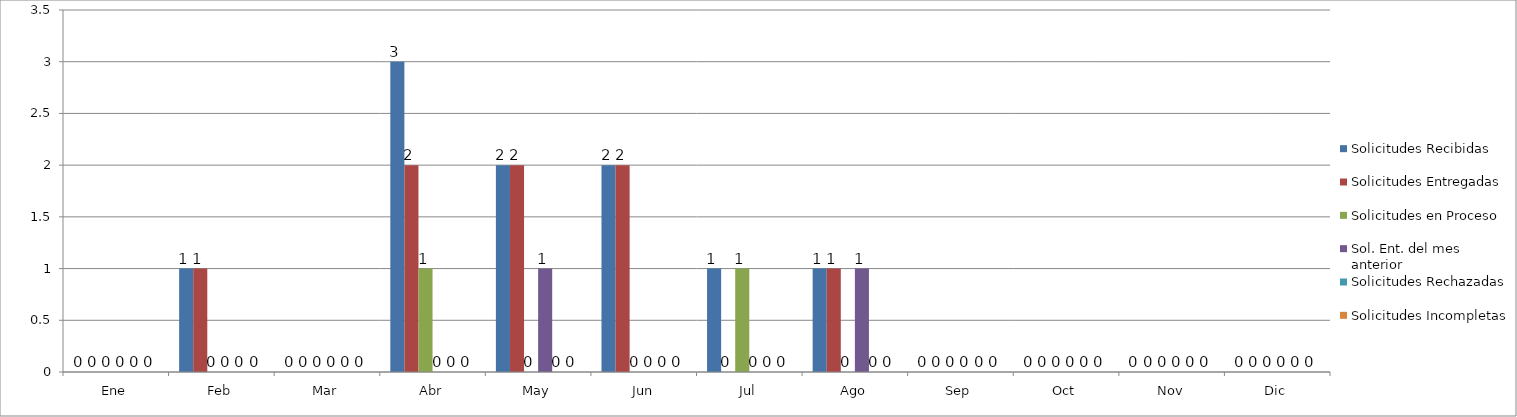
| Category | Solicitudes Recibidas  | Solicitudes Entregadas | Solicitudes en Proceso | Sol. Ent. del mes anterior | Solicitudes Rechazadas | Solicitudes Incompletas |
|---|---|---|---|---|---|---|
| Ene | 0 | 0 | 0 | 0 | 0 | 0 |
| Feb | 1 | 1 | 0 | 0 | 0 | 0 |
| Mar | 0 | 0 | 0 | 0 | 0 | 0 |
| Abr | 3 | 2 | 1 | 0 | 0 | 0 |
| May | 2 | 2 | 0 | 1 | 0 | 0 |
| Jun | 2 | 2 | 0 | 0 | 0 | 0 |
| Jul | 1 | 0 | 1 | 0 | 0 | 0 |
| Ago | 1 | 1 | 0 | 1 | 0 | 0 |
| Sep | 0 | 0 | 0 | 0 | 0 | 0 |
| Oct | 0 | 0 | 0 | 0 | 0 | 0 |
| Nov | 0 | 0 | 0 | 0 | 0 | 0 |
| Dic | 0 | 0 | 0 | 0 | 0 | 0 |